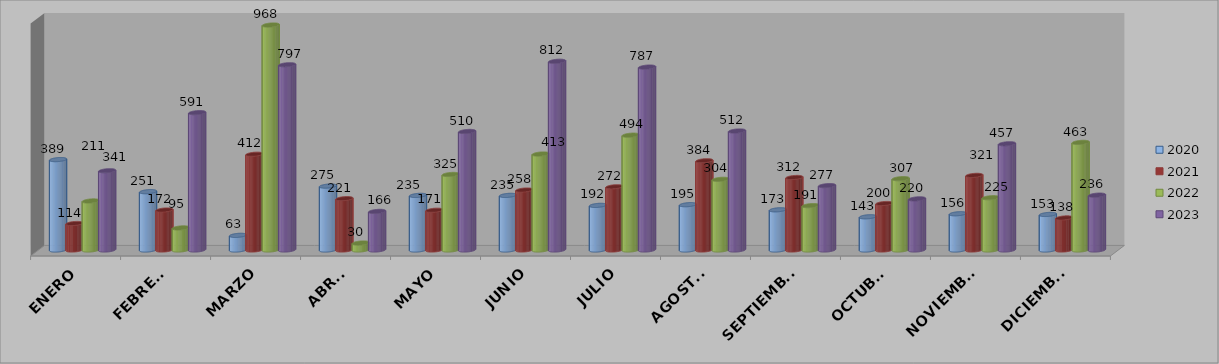
| Category | 2020 | 2021 | 2022 | 2023 |
|---|---|---|---|---|
| ENERO | 389 | 114 | 211 | 341 |
| FEBRERO | 251 | 172 | 95 | 591 |
| MARZO | 63 | 412 | 968 | 797 |
| ABRIL | 275 | 221 | 30 | 166 |
| MAYO | 235 | 171 | 325 | 510 |
| JUNIO | 235 | 258 | 413 | 812 |
| JULIO | 192 | 272 | 494 | 787 |
| AGOSTO | 195 | 384 | 304 | 512 |
| SEPTIEMBRE | 173 | 312 | 191 | 277 |
| OCTUBRE | 143 | 200 | 307 | 220 |
| NOVIEMBRE | 156 | 321 | 225 | 457 |
| DICIEMBRE | 153 | 138 | 463 | 236 |